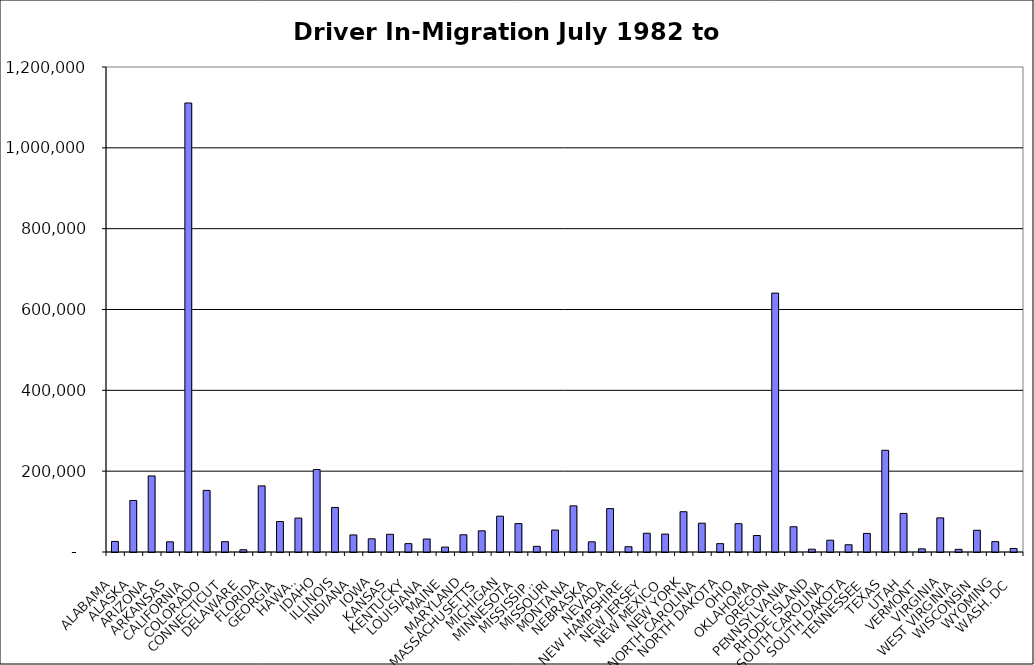
| Category | Series 0 |
|---|---|
| ALABAMA | 26136.5 |
| ALASKA | 127446.5 |
| ARIZONA | 188202 |
| ARKANSAS | 25151.5 |
| CALIFORNIA | 1110904.5 |
| COLORADO | 152476 |
| CONNECTICUT | 25525 |
| DELAWARE | 5594.5 |
| FLORIDA | 163538 |
| GEORGIA | 75341 |
| HAWAII | 83905.5 |
| IDAHO | 203892.5 |
| ILLINOIS | 110264.5 |
| INDIANA | 42243 |
| IOWA | 32634.5 |
| KANSAS | 43833.5 |
| KENTUCKY | 20709 |
| LOUISIANA | 32121.5 |
| MAINE | 12198.5 |
| MARYLAND | 42568 |
| MASSACHUSETTS | 52415 |
| MICHIGAN | 88665 |
| MINNESOTA | 70295.5 |
| MISSISSIPPI | 14002 |
| MISSOURI | 54325 |
| MONTANA | 114177 |
| NEBRASKA | 25140.5 |
| NEVADA | 107331 |
| NEW HAMPSHIRE | 13136.5 |
| NEW JERSEY | 46453 |
| NEW MEXICO | 44336 |
| NEW YORK | 99661 |
| NORTH CAROLINA | 71265.5 |
| NORTH DAKOTA | 20673.5 |
| OHIO | 70063.5 |
| OKLAHOMA | 40858 |
| OREGON | 640533 |
| PENNSYLVANIA | 62482.5 |
| RHODE ISLAND | 6931 |
| SOUTH CAROLINA | 29124.5 |
| SOUTH DAKOTA | 17902.5 |
| TENNESSEE | 46003.5 |
| TEXAS | 251676 |
| UTAH | 95456.5 |
| VERMONT | 7777 |
| VIRGINIA | 84409 |
| WEST VIRGINIA | 6572.5 |
| WISCONSIN | 53741.5 |
| WYOMING | 25653 |
| WASH. DC | 8667 |